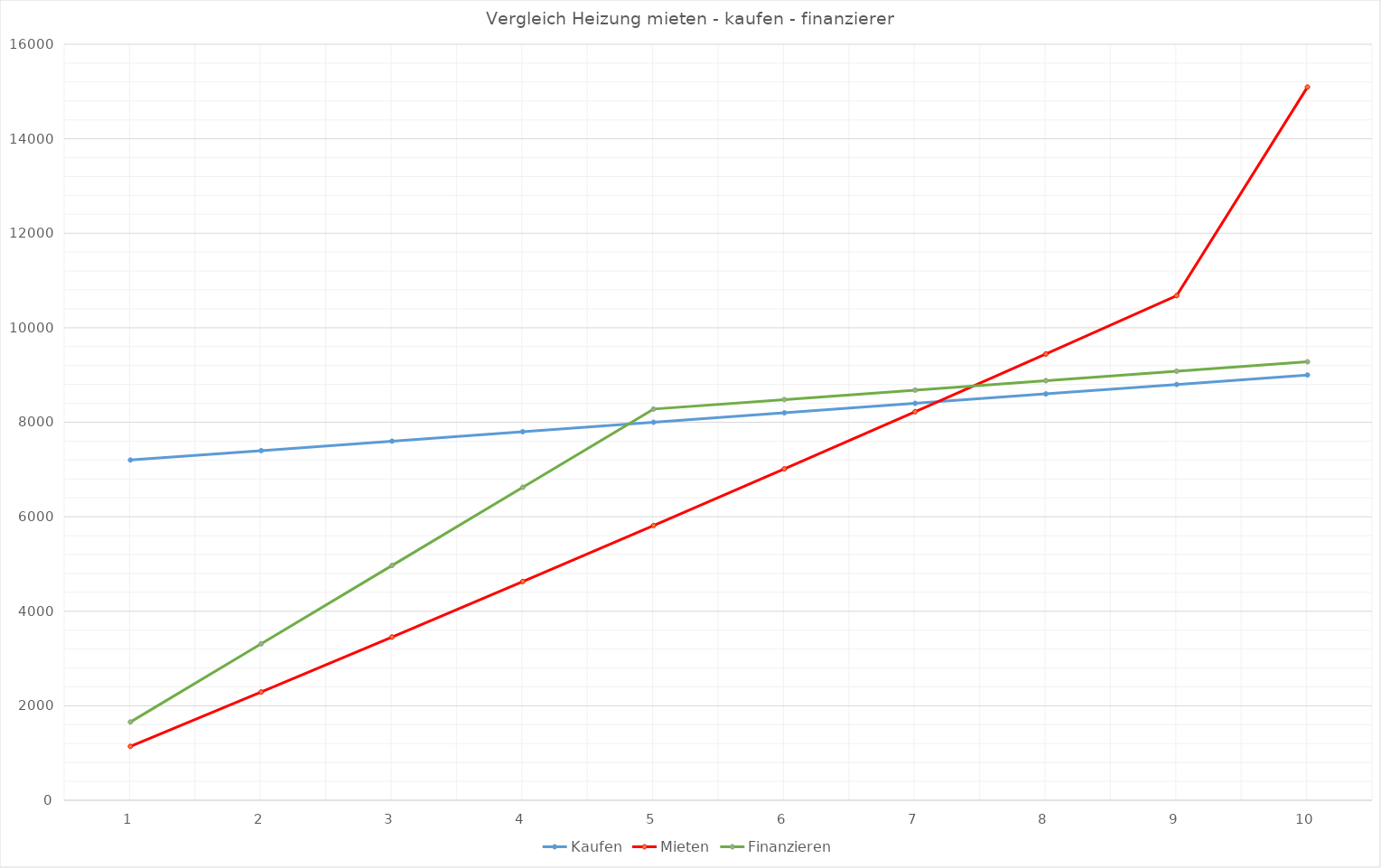
| Category | Kaufen | Mieten | Finanzieren |
|---|---|---|---|
| 0 | 7200 | 1140 | 1656 |
| 1 | 7400 | 2291.4 | 3312 |
| 2 | 7600 | 3454.314 | 4968 |
| 3 | 7800 | 4628.857 | 6624 |
| 4 | 8000 | 5815.146 | 8280 |
| 5 | 8200 | 7013.297 | 8480 |
| 6 | 8400 | 8223.43 | 8680 |
| 7 | 8600 | 9445.664 | 8880 |
| 8 | 8800 | 10680.121 | 9080 |
| 9 | 9000 | 15093.589 | 9280 |